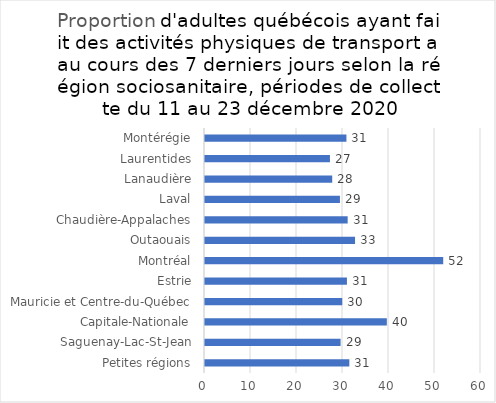
| Category | Oui |
|---|---|
| Petites régions | 31.377 |
| Saguenay-Lac-St-Jean | 29.476 |
| Capitale-Nationale | 39.528 |
| Mauricie et Centre-du-Québec | 29.834 |
| Estrie | 30.857 |
| Montréal | 51.786 |
| Outaouais | 32.621 |
| Chaudière-Appalaches | 31.015 |
| Laval | 29.334 |
| Lanaudière | 27.658 |
| Laurentides | 27.162 |
| Montérégie | 30.746 |